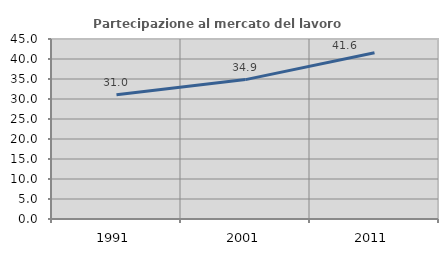
| Category | Partecipazione al mercato del lavoro  femminile |
|---|---|
| 1991.0 | 31.038 |
| 2001.0 | 34.851 |
| 2011.0 | 41.569 |